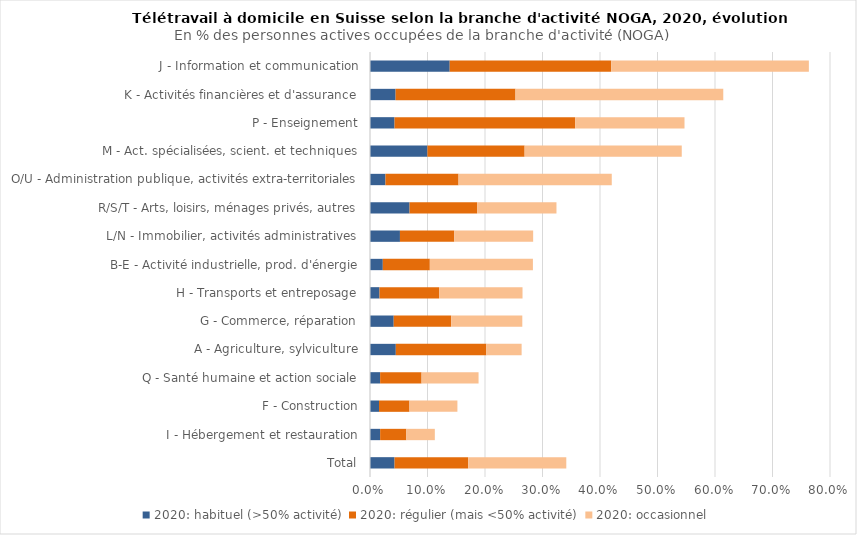
| Category | 2020: habituel (>50% activité) | 2020: régulier (mais <50% activité) | 2020: occasionnel  |
|---|---|---|---|
| Total | 0.043 | 0.128 | 0.171 |
| I - Hébergement et restauration | 0.018 | 0.046 | 0.05 |
| F - Construction | 0.016 | 0.053 | 0.083 |
| Q - Santé humaine et action sociale | 0.018 | 0.072 | 0.099 |
| A - Agriculture, sylviculture | 0.045 | 0.157 | 0.061 |
| G - Commerce, réparation | 0.041 | 0.1 | 0.124 |
| H - Transports et entreposage | 0.017 | 0.104 | 0.145 |
| B-E - Activité industrielle, prod. d'énergie | 0.022 | 0.082 | 0.179 |
| L/N - Immobilier, activités administratives | 0.052 | 0.095 | 0.137 |
| R/S/T - Arts, loisirs, ménages privés, autres | 0.069 | 0.117 | 0.138 |
| O/U - Administration publique, activités extra-territoriales | 0.027 | 0.127 | 0.266 |
| M - Act. spécialisées, scient. et techniques | 0.1 | 0.169 | 0.273 |
| P - Enseignement | 0.043 | 0.314 | 0.19 |
| K - Activités financières et d'assurance | 0.045 | 0.208 | 0.361 |
| J - Information et communication | 0.139 | 0.281 | 0.344 |